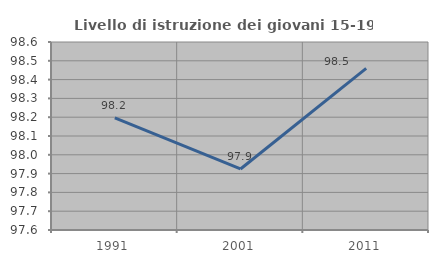
| Category | Livello di istruzione dei giovani 15-19 anni |
|---|---|
| 1991.0 | 98.196 |
| 2001.0 | 97.925 |
| 2011.0 | 98.46 |